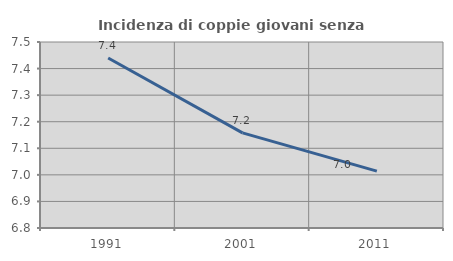
| Category | Incidenza di coppie giovani senza figli |
|---|---|
| 1991.0 | 7.44 |
| 2001.0 | 7.158 |
| 2011.0 | 7.014 |